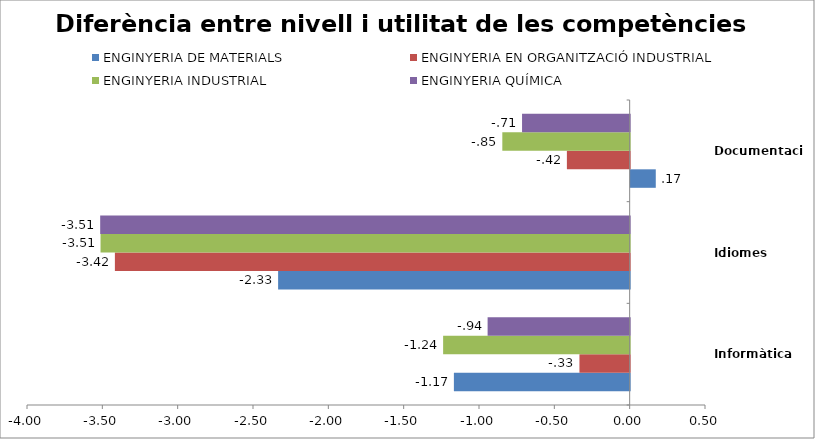
| Category | ENGINYERIA DE MATERIALS | ENGINYERIA EN ORGANITZACIÓ INDUSTRIAL | ENGINYERIA INDUSTRIAL | ENGINYERIA QUÍMICA |
|---|---|---|---|---|
| Informàtica | -1.167 | -0.333 | -1.238 | -0.943 |
| Idiomes | -2.333 | -3.417 | -3.512 | -3.514 |
| Documentació | 0.167 | -0.417 | -0.845 | -0.714 |